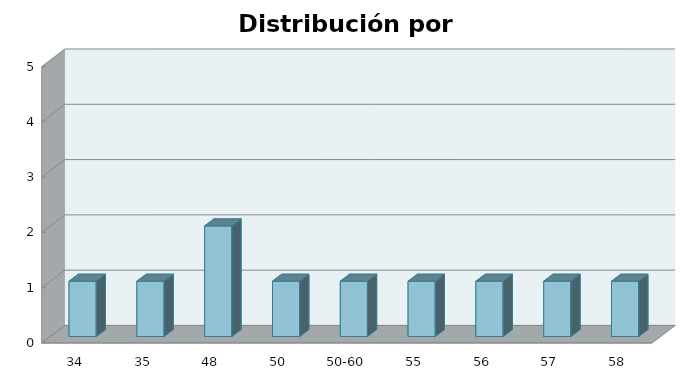
| Category | Series 1 |
|---|---|
| 34 | 1 |
| 35 | 1 |
| 48 | 2 |
| 50 | 1 |
| 50-60 | 1 |
| 55 | 1 |
| 56 | 1 |
| 57 | 1 |
| 58 | 1 |